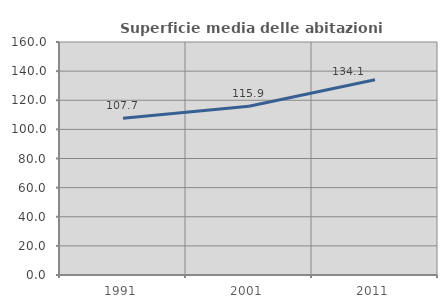
| Category | Superficie media delle abitazioni occupate |
|---|---|
| 1991.0 | 107.666 |
| 2001.0 | 115.893 |
| 2011.0 | 134.134 |